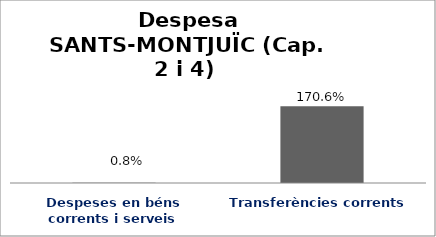
| Category | Series 0 |
|---|---|
| Despeses en béns corrents i serveis | 0.008 |
| Transferències corrents | 1.706 |